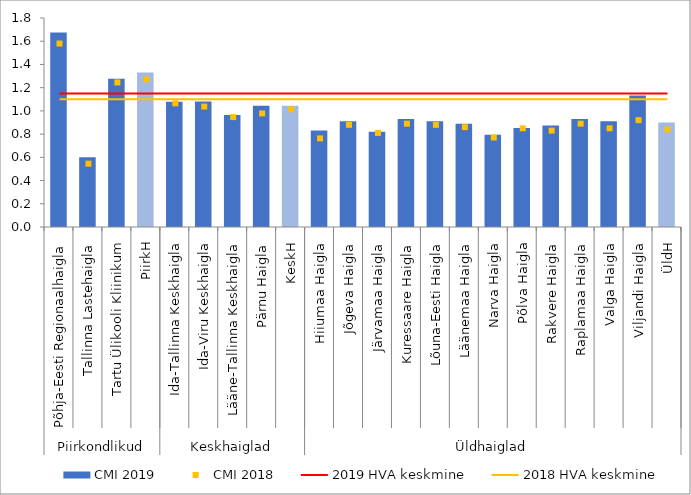
| Category | CMI 2019 |
|---|---|
| 0 | 1.675 |
| 1 | 0.601 |
| 2 | 1.278 |
| 3 | 1.331 |
| 4 | 1.078 |
| 5 | 1.08 |
| 6 | 0.965 |
| 7 | 1.044 |
| 8 | 1.044 |
| 9 | 0.83 |
| 10 | 0.91 |
| 11 | 0.82 |
| 12 | 0.93 |
| 13 | 0.91 |
| 14 | 0.89 |
| 15 | 0.794 |
| 16 | 0.853 |
| 17 | 0.875 |
| 18 | 0.931 |
| 19 | 0.911 |
| 20 | 1.133 |
| 21 | 0.901 |